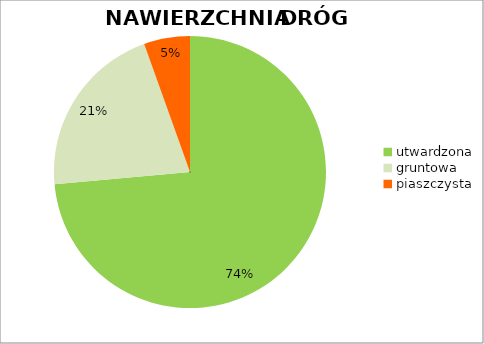
| Category | Series 0 |
|---|---|
| utwardzona | 0.736 |
| gruntowa | 0.21 |
| piaszczysta | 0.055 |